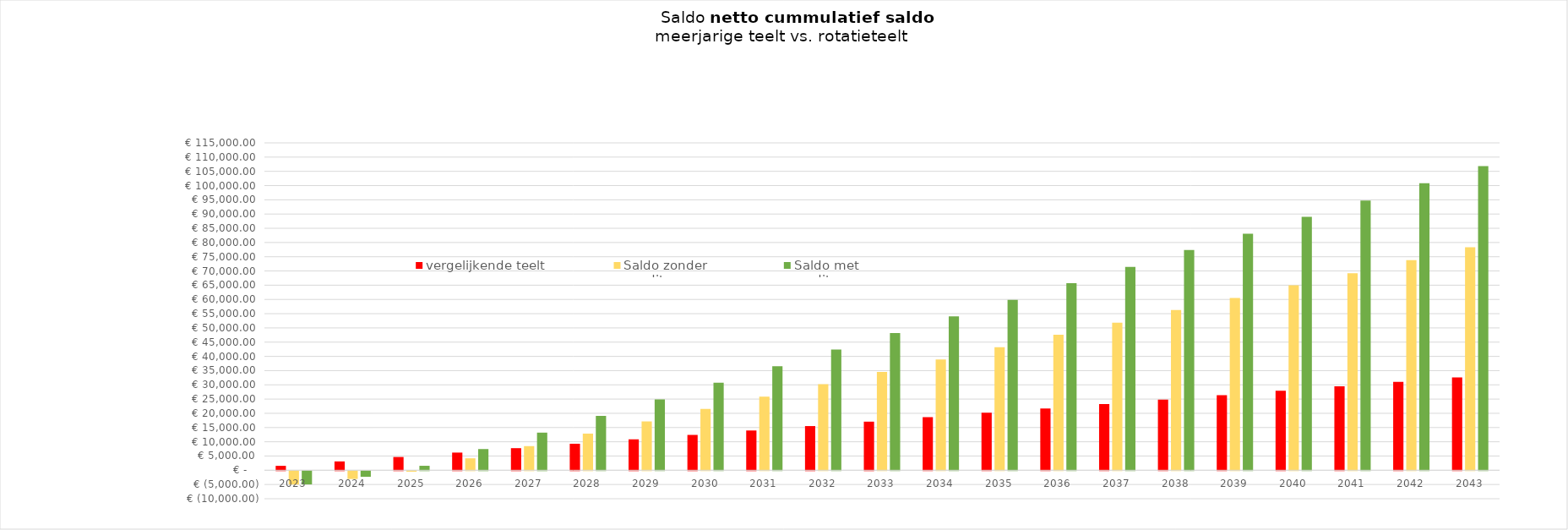
| Category | vergelijkende teelt | Saldo zonder
 credits | Saldo met 
credits  |
|---|---|---|---|
| 2023.0 | 1552 | -4696 | -4676.4 |
| 2024.0 | 3104 | -2769 | -2007.61 |
| 2025.0 | 4656 | -199 | 1566.96 |
| 2026.0 | 6208 | 4196 | 7447.99 |
| 2027.0 | 7760 | 8478 | 13216.02 |
| 2028.0 | 9312 | 12873 | 19097.05 |
| 2029.0 | 10864 | 17155 | 24865.08 |
| 2030.0 | 12416 | 21550 | 30746.11 |
| 2031.0 | 13968 | 25832 | 36514.14 |
| 2032.0 | 15520 | 30227 | 42395.17 |
| 2033.0 | 17072 | 34509 | 48163.2 |
| 2034.0 | 18624 | 38904 | 54044.23 |
| 2035.0 | 20176 | 43186 | 59812.26 |
| 2036.0 | 21728 | 47581 | 65693.29 |
| 2037.0 | 23280 | 51863 | 71461.32 |
| 2038.0 | 24832 | 56258 | 77342.35 |
| 2039.0 | 26384 | 60540 | 83110.38 |
| 2040.0 | 27936 | 64935 | 88991.41 |
| 2041.0 | 29488 | 69217 | 94759.44 |
| 2042.0 | 31040 | 73777 | 100805.47 |
| 2043.0 | 32592 | 78337 | 106851.5 |